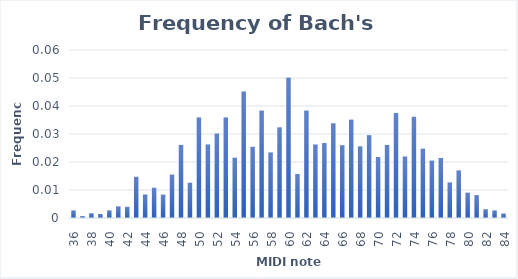
| Category | Series 0 |
|---|---|
| 36.0 | 0.003 |
| 37.0 | 0.001 |
| 38.0 | 0.002 |
| 39.0 | 0.001 |
| 40.0 | 0.003 |
| 41.0 | 0.004 |
| 42.0 | 0.004 |
| 43.0 | 0.015 |
| 44.0 | 0.008 |
| 45.0 | 0.011 |
| 46.0 | 0.008 |
| 47.0 | 0.015 |
| 48.0 | 0.026 |
| 49.0 | 0.013 |
| 50.0 | 0.036 |
| 51.0 | 0.026 |
| 52.0 | 0.03 |
| 53.0 | 0.036 |
| 54.0 | 0.022 |
| 55.0 | 0.045 |
| 56.0 | 0.025 |
| 57.0 | 0.038 |
| 58.0 | 0.023 |
| 59.0 | 0.032 |
| 60.0 | 0.05 |
| 61.0 | 0.016 |
| 62.0 | 0.038 |
| 63.0 | 0.026 |
| 64.0 | 0.027 |
| 65.0 | 0.034 |
| 66.0 | 0.026 |
| 67.0 | 0.035 |
| 68.0 | 0.026 |
| 69.0 | 0.03 |
| 70.0 | 0.022 |
| 71.0 | 0.026 |
| 72.0 | 0.037 |
| 73.0 | 0.022 |
| 74.0 | 0.036 |
| 75.0 | 0.025 |
| 76.0 | 0.02 |
| 77.0 | 0.021 |
| 78.0 | 0.013 |
| 79.0 | 0.017 |
| 80.0 | 0.009 |
| 81.0 | 0.008 |
| 82.0 | 0.003 |
| 83.0 | 0.003 |
| 84.0 | 0.002 |